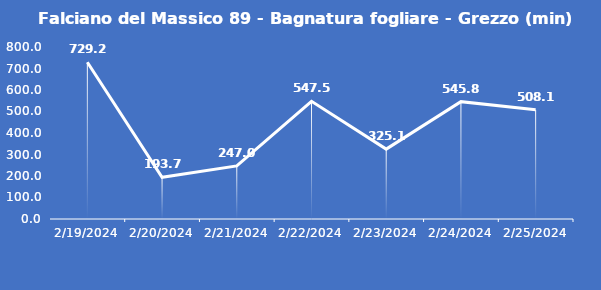
| Category | Falciano del Massico 89 - Bagnatura fogliare - Grezzo (min) |
|---|---|
| 2/19/24 | 729.2 |
| 2/20/24 | 193.7 |
| 2/21/24 | 247 |
| 2/22/24 | 547.5 |
| 2/23/24 | 325.1 |
| 2/24/24 | 545.8 |
| 2/25/24 | 508.1 |